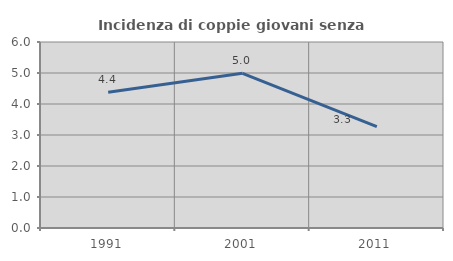
| Category | Incidenza di coppie giovani senza figli |
|---|---|
| 1991.0 | 4.379 |
| 2001.0 | 4.991 |
| 2011.0 | 3.268 |